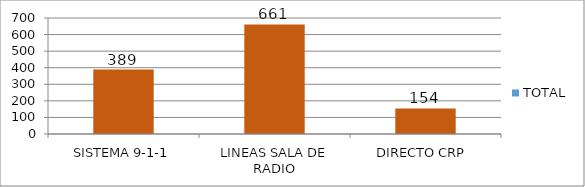
| Category | TOTAL |
|---|---|
| SISTEMA 9-1-1 | 389 |
| LINEAS SALA DE RADIO | 661 |
| DIRECTO CRP  | 154 |